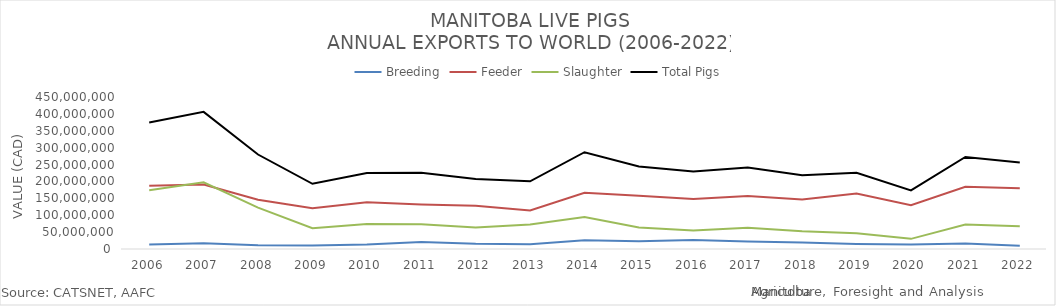
| Category | Breeding | Feeder | Slaughter | Total Pigs |
|---|---|---|---|---|
| 2006 | 13619409 | 186987471 | 173904277 | 374511157 |
| 2007 | 17315003 | 191080081 | 197553713 | 405948797 |
| 2008 | 11323160 | 145885944 | 122525909 | 279735013 |
| 2009 | 10369090 | 121022983 | 61596656 | 192988729 |
| 2010 | 13100711 | 138186659 | 73744012 | 225031382 |
| 2011 | 20804254 | 131622663 | 73556882 | 225983799 |
| 2012 | 15440498 | 128183546 | 63365682 | 206989726 |
| 2013 | 13858913 | 113823509 | 72828064 | 200510486 |
| 2014 | 25555040 | 166361332 | 94664149 | 286580521 |
| 2015 | 23305918 | 157421216 | 63611767 | 244338901 |
| 2016 | 26716022 | 148123598 | 54448265 | 229287885 |
| 2017 | 22179168 | 156586979 | 62787752 | 241553899 |
| 2018 | 19067053 | 146584255 | 52361032 | 218012340 |
| 2019 | 14921238 | 164041497 | 46800000 | 225762735 |
| 2020 | 13689209 | 129632278 | 30034105 | 173355592 |
| 2021 | 16201454 | 184004273 | 72437495 | 272643222 |
| 2022 | 9320616 | 179612713 | 66984509 | 255917838 |